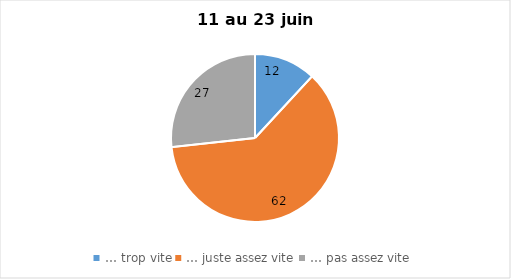
| Category | Series 0 |
|---|---|
| … trop vite | 12 |
| … juste assez vite | 62 |
| … pas assez vite | 27 |